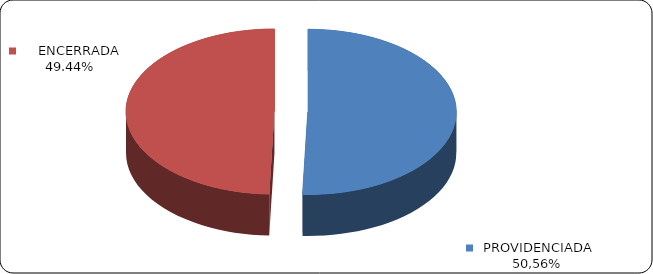
| Category | Series 0 |
|---|---|
|      PROVIDENCIADA | 0.506 |
|      ENCERRADA | 0.494 |